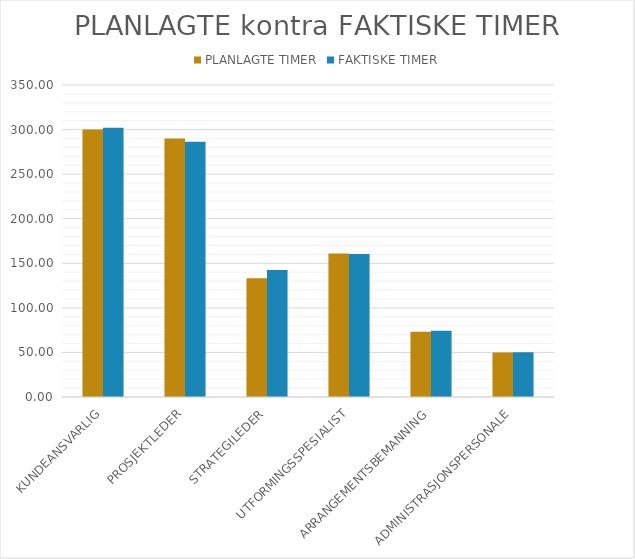
| Category | PLANLAGTE TIMER | FAKTISKE TIMER |
|---|---|---|
| KUNDEANSVARLIG | 300 | 302 |
| PROSJEKTLEDER | 290 | 286.333 |
| STRATEGILEDER | 133.333 | 142.5 |
| UTFORMINGSSPESIALIST | 161.111 | 160.556 |
| ARRANGEMENTSBEMANNING | 73.333 | 74.444 |
| ADMINISTRASJONSPERSONALE | 50 | 50.333 |